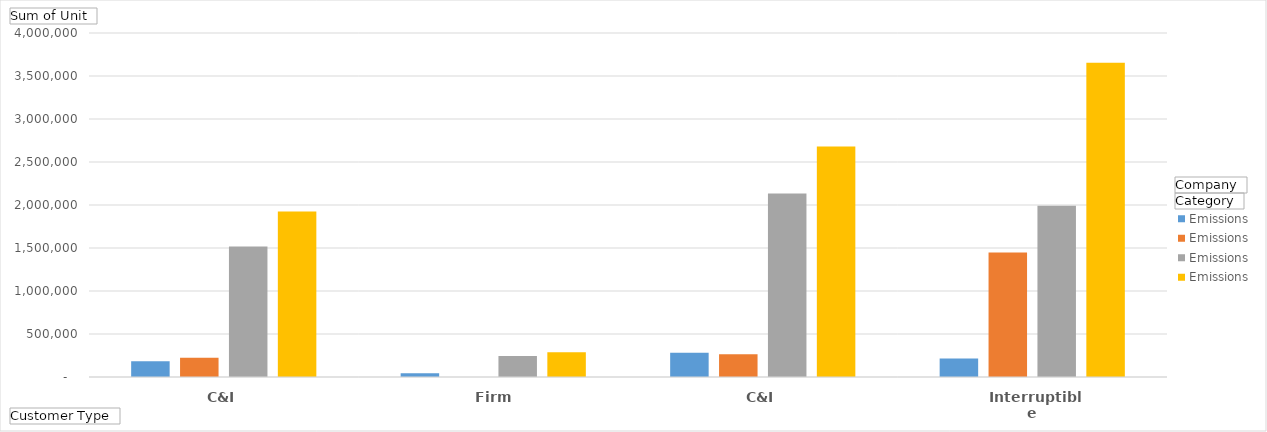
| Category | Avista - Emissions | CNG - Emissions | NWN - Emissions | OR Industry - Emissions |
|---|---|---|---|---|
| C&I, Firm | 183581.273 | 223173.985 | 1517090.02 | 1923845.278 |
| C&I, Interruptible | 43167.562 | 0 | 244822.232 | 287989.794 |
| Residential | 283219.333 | 264818.878 | 2132364.163 | 2680402.374 |
| Transport | 214096.235 | 1447402.133 | 1992144.809 | 3653643.176 |